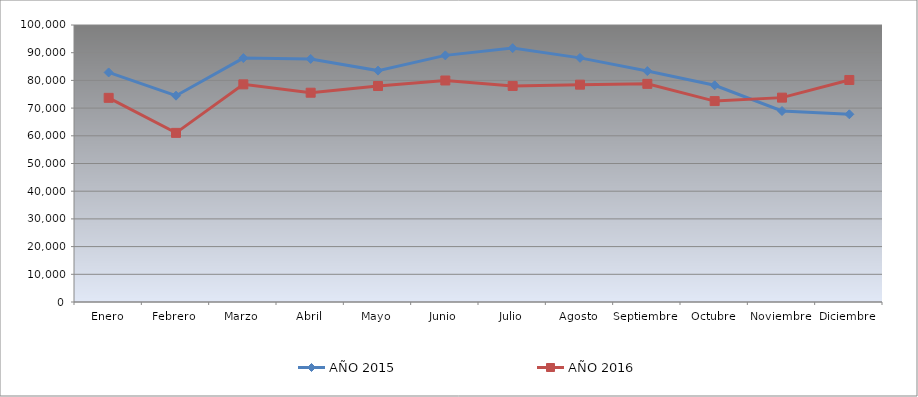
| Category | AÑO 2015 | AÑO 2016 |
|---|---|---|
| Enero | 82869.463 | 73706.667 |
| Febrero | 74480.681 | 61061.387 |
| Marzo | 88062.518 | 78573.716 |
| Abril | 87747.446 | 75555.128 |
| Mayo | 83538.99 | 77968.867 |
| Junio | 89035.864 | 79964.301 |
| Julio | 91652.084 | 78002.784 |
| Agosto | 88130.033 | 78460.66 |
| Septiembre | 83375.828 | 78754.605 |
| Octubre | 78233.409 | 72530.888 |
| Noviembre | 68950.048 | 73780.154 |
| Diciembre | 67757.277 | 80150.843 |